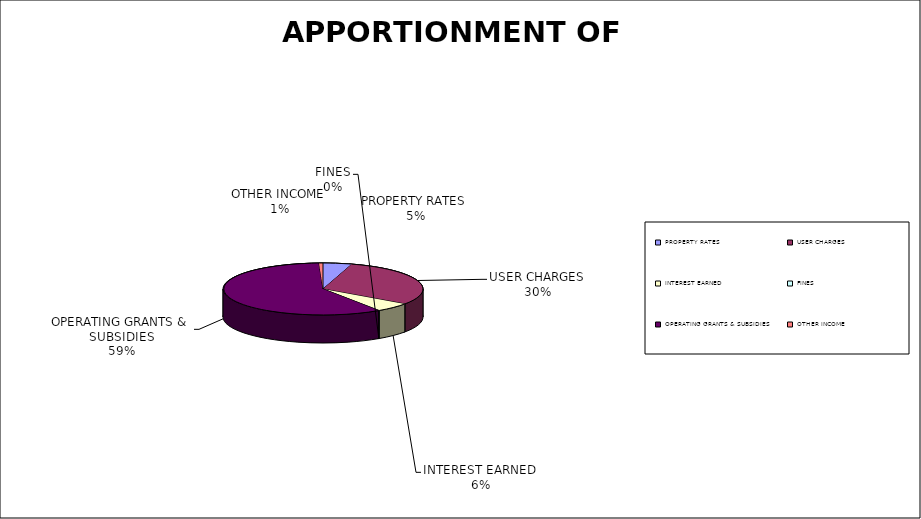
| Category | Series 0 |
|---|---|
| PROPERTY RATES | 10980450.426 |
| USER CHARGES | 70687213.179 |
| INTEREST EARNED | 13539457.536 |
| FINES | 225000 |
| OPERATING GRANTS & SUBSIDIES | 138042000 |
| OTHER INCOME | 1522477.642 |